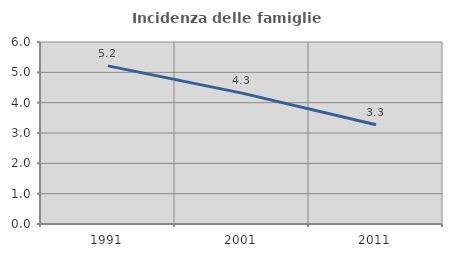
| Category | Incidenza delle famiglie numerose |
|---|---|
| 1991.0 | 5.212 |
| 2001.0 | 4.315 |
| 2011.0 | 3.272 |